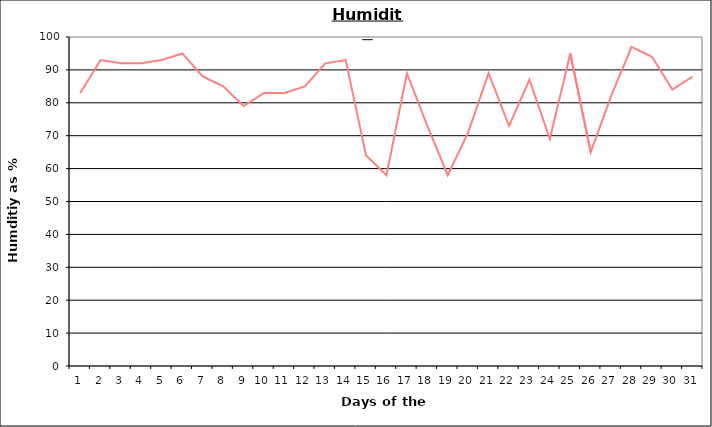
| Category | Series 0 |
|---|---|
| 0 | 83 |
| 1 | 93 |
| 2 | 92 |
| 3 | 92 |
| 4 | 93 |
| 5 | 95 |
| 6 | 88 |
| 7 | 85 |
| 8 | 79 |
| 9 | 83 |
| 10 | 83 |
| 11 | 85 |
| 12 | 92 |
| 13 | 93 |
| 14 | 64 |
| 15 | 58 |
| 16 | 89 |
| 17 | 73 |
| 18 | 58 |
| 19 | 71 |
| 20 | 89 |
| 21 | 73 |
| 22 | 87 |
| 23 | 69 |
| 24 | 95 |
| 25 | 65 |
| 26 | 82 |
| 27 | 97 |
| 28 | 94 |
| 29 | 84 |
| 30 | 88 |